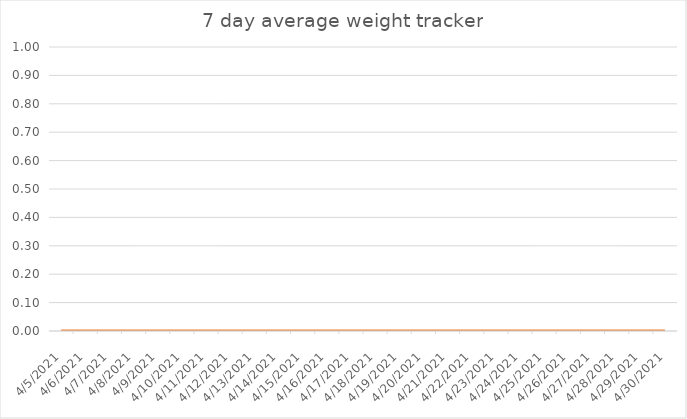
| Category | Series 0 | Series 1 |
|---|---|---|
| 4/5/21 |  | 0 |
| 4/6/21 |  | 0 |
| 4/7/21 |  | 0 |
| 4/8/21 |  | 0 |
| 4/9/21 |  | 0 |
| 4/10/21 |  | 0 |
| 4/11/21 |  | 0 |
| 4/12/21 |  | 0 |
| 4/13/21 |  | 0 |
| 4/14/21 |  | 0 |
| 4/15/21 |  | 0 |
| 4/16/21 |  | 0 |
| 4/17/21 |  | 0 |
| 4/18/21 |  | 0 |
| 4/19/21 |  | 0 |
| 4/20/21 |  | 0 |
| 4/21/21 |  | 0 |
| 4/22/21 |  | 0 |
| 4/23/21 |  | 0 |
| 4/24/21 |  | 0 |
| 4/25/21 |  | 0 |
| 4/26/21 |  | 0 |
| 4/27/21 |  | 0 |
| 4/28/21 |  | 0 |
| 4/29/21 |  | 0 |
| 4/30/21 |  | 0 |